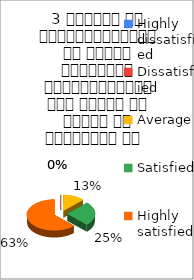
| Category | 3 शिक्षक का विद्यार्थियों के प्रति व्यव्हार मित्रतापूर्ण एवं सहयोग के भावना से परिपूर्ण था   |
|---|---|
| Highly dissatisfied | 0 |
| Dissatisfied | 0 |
| Average | 1 |
| Satisfied | 2 |
| Highly satisfied | 5 |